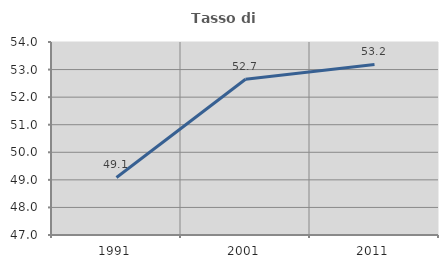
| Category | Tasso di occupazione   |
|---|---|
| 1991.0 | 49.088 |
| 2001.0 | 52.651 |
| 2011.0 | 53.187 |